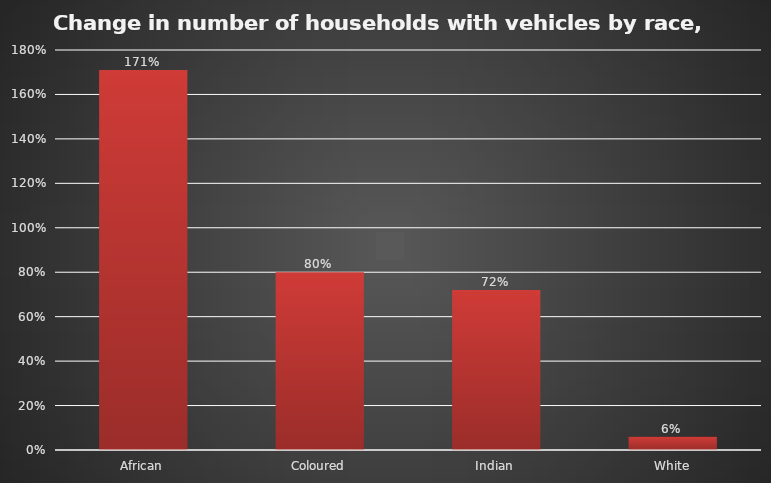
| Category | Series 0 |
|---|---|
| African | 1.71 |
| Coloured | 0.8 |
| Indian | 0.72 |
| White | 0.06 |